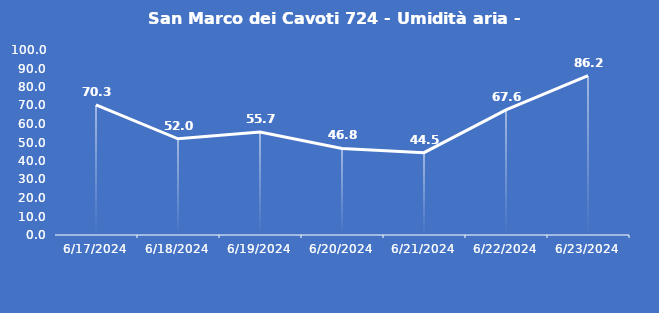
| Category | San Marco dei Cavoti 724 - Umidità aria - Grezzo (%) |
|---|---|
| 6/17/24 | 70.3 |
| 6/18/24 | 52 |
| 6/19/24 | 55.7 |
| 6/20/24 | 46.8 |
| 6/21/24 | 44.5 |
| 6/22/24 | 67.6 |
| 6/23/24 | 86.2 |